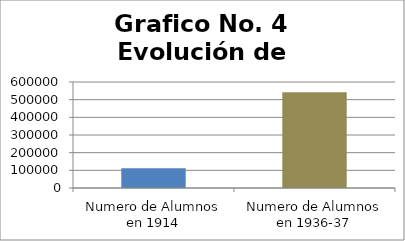
| Category | EVOLUCION ALUMNOS |
|---|---|
| Numero de Alumnos en 1914 | 112000 |
| Numero de Alumnos en 1936-37 | 542000 |